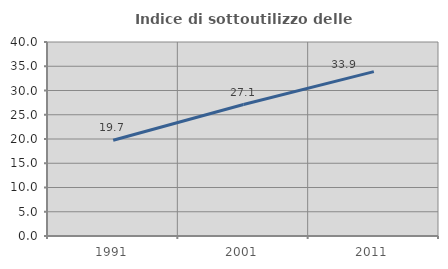
| Category | Indice di sottoutilizzo delle abitazioni  |
|---|---|
| 1991.0 | 19.735 |
| 2001.0 | 27.11 |
| 2011.0 | 33.886 |